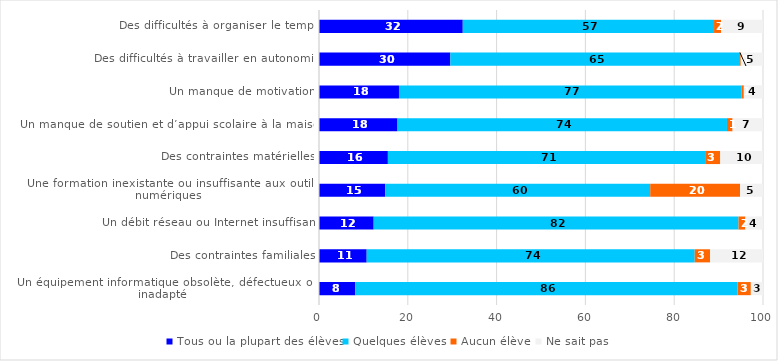
| Category | Tous ou la plupart des élèves | Quelques élèves | Aucun élève | Ne sait pas |
|---|---|---|---|---|
| Des difficultés à organiser le temps | 32.38 | 56.596 | 1.597 | 9.427 |
| Des difficultés à travailler en autonomie | 29.581 | 65.037 | 0.381 | 5.001 |
| Un manque de motivation | 18.014 | 77.117 | 0.551 | 4.318 |
| Un manque de soutien et d’appui scolaire à la maison | 17.688 | 74.2 | 1.267 | 6.844 |
| Des contraintes matérielles | 15.512 | 71.457 | 3.405 | 9.626 |
| Une formation inexistante ou insuffisante aux outils 
numériques | 14.916 | 59.684 | 20.24 | 5.16 |
| Un débit réseau ou Internet insuffisant | 12.316 | 82.173 | 1.54 | 3.971 |
| Des contraintes familiales | 10.741 | 73.879 | 3.47 | 11.91 |
| Un équipement informatique obsolète, défectueux ou 
inadapté | 8.179 | 86.086 | 2.998 | 2.737 |